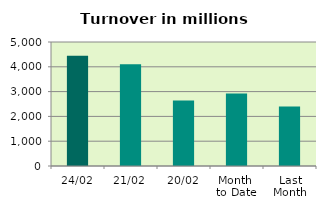
| Category | Series 0 |
|---|---|
| 24/02 | 4449.189 |
| 21/02 | 4106.084 |
| 20/02 | 2641.545 |
| Month 
to Date | 2924.417 |
| Last
Month | 2394.171 |